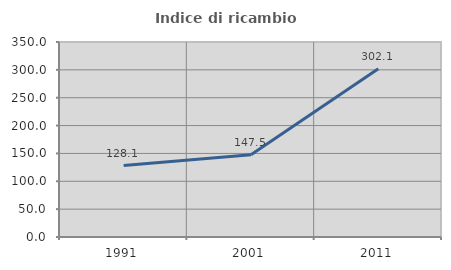
| Category | Indice di ricambio occupazionale  |
|---|---|
| 1991.0 | 128.125 |
| 2001.0 | 147.541 |
| 2011.0 | 302.128 |